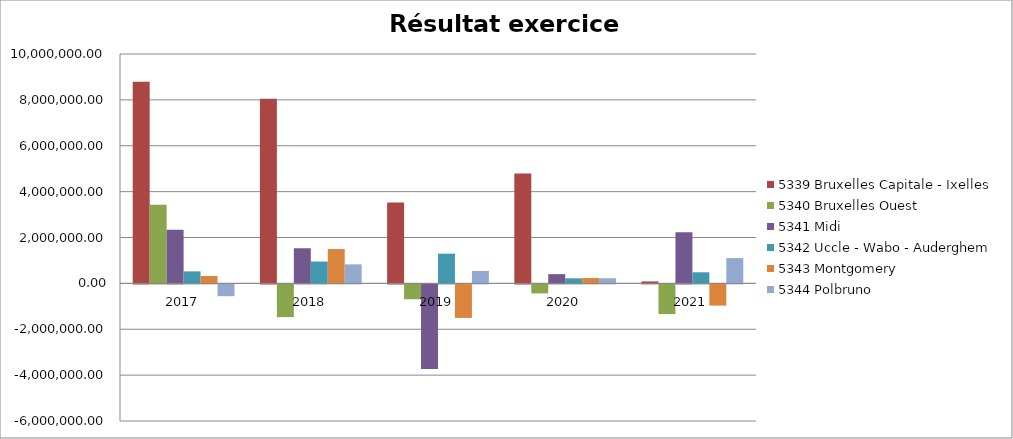
| Category | 5339 Bruxelles Capitale - Ixelles | 5340 Bruxelles Ouest | 5341 Midi | 5342 Uccle - Wabo - Auderghem | 5343 Montgomery | 5344 Polbruno |
|---|---|---|---|---|---|---|
| 2017.0 | 8789762.34 | 3427927.16 | 2338978.2 | 523011.41 | 322280.19 | -514202.95 |
| 2018.0 | 8045507.23 | -1426900.94 | 1531268.55 | 951824.05 | 1496882.98 | 828885.98 |
| 2019.0 | 3521928.58 | -648344.97 | -3691256.53 | 1294766.93 | -1462195.42 | 541661.69 |
| 2020.0 | 4786282.18 | -393849.81 | 402093.26 | 220615.89 | 232521.12 | 224143.92 |
| 2021.0 | 85096.24 | -1294056.24 | 2232856.64 | 483388.38 | -926217.32 | 1101908.21 |